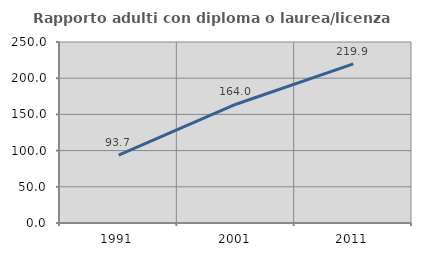
| Category | Rapporto adulti con diploma o laurea/licenza media  |
|---|---|
| 1991.0 | 93.713 |
| 2001.0 | 164.023 |
| 2011.0 | 219.86 |